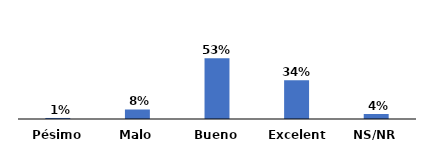
| Category | Series 0 |
|---|---|
| Pésimo | 0.009 |
| Malo | 0.083 |
| Bueno | 0.528 |
| Excelente | 0.337 |
| NS/NR | 0.044 |